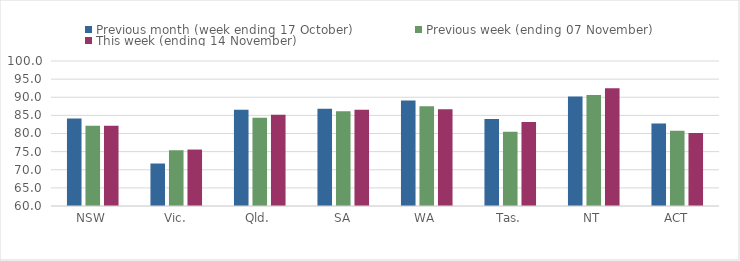
| Category | Previous month (week ending 17 October) | Previous week (ending 07 November) | This week (ending 14 November) |
|---|---|---|---|
| NSW | 84.16 | 82.13 | 82.13 |
| Vic. | 71.72 | 75.38 | 75.57 |
| Qld. | 86.58 | 84.34 | 85.15 |
| SA | 86.8 | 86.12 | 86.57 |
| WA | 89.12 | 87.52 | 86.68 |
| Tas. | 84.03 | 80.45 | 83.15 |
| NT | 90.19 | 90.63 | 92.45 |
| ACT | 82.77 | 80.73 | 80.15 |